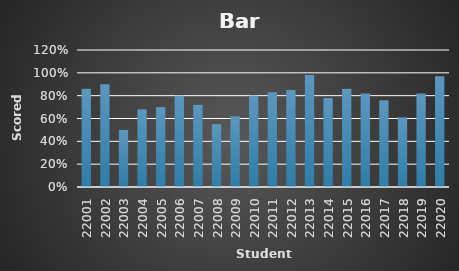
| Category | Series 0 |
|---|---|
| 22001.0 | 0.86 |
| 22002.0 | 0.9 |
| 22003.0 | 0.5 |
| 22004.0 | 0.68 |
| 22005.0 | 0.7 |
| 22006.0 | 0.8 |
| 22007.0 | 0.72 |
| 22008.0 | 0.55 |
| 22009.0 | 0.62 |
| 22010.0 | 0.8 |
| 22011.0 | 0.83 |
| 22012.0 | 0.85 |
| 22013.0 | 0.98 |
| 22014.0 | 0.78 |
| 22015.0 | 0.86 |
| 22016.0 | 0.82 |
| 22017.0 | 0.76 |
| 22018.0 | 0.61 |
| 22019.0 | 0.82 |
| 22020.0 | 0.97 |